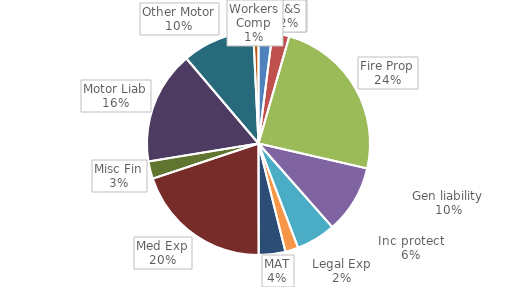
| Category | Series 0 |
|---|---|
| Assistance | 11381.91 |
| C&S | 13928.81 |
| Fire Prop | 137082.12 |
| Gen liability | 56241.46 |
| Inc protect | 32583.73 |
| Legal Exp | 10724.54 |
| MAT | 21942.67 |
| Med Exp | 113182.44 |
| Misc Fin | 14366.76 |
| Motor Liab | 93029.47 |
| Other Motor | 59338.06 |
| Workers Comp | 4279.23 |